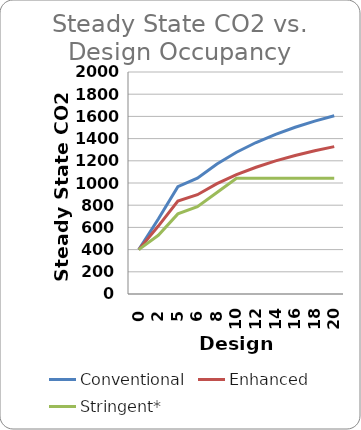
| Category | Conventional | Enhanced | Stringent* |
|---|---|---|---|
| 0.0 | 400 | 400 | 400 |
| 2.0 | 675.62 | 612.016 | 528.623 |
| 5.0 | 967.453 | 836.503 | 721.557 |
| 6.0 | 1043.114 | 894.703 | 785.868 |
| 8.0 | 1171.737 | 993.644 | 914.491 |
| 10.0 | 1276.973 | 1074.595 | 1043.114 |
| 12.0 | 1364.671 | 1142.054 | 1043.114 |
| 14.0 | 1438.876 | 1199.136 | 1043.114 |
| 16.0 | 1502.481 | 1248.062 | 1043.114 |
| 18.0 | 1557.605 | 1290.465 | 1043.114 |
| 20.0 | 1605.838 | 1327.568 | 1043.114 |